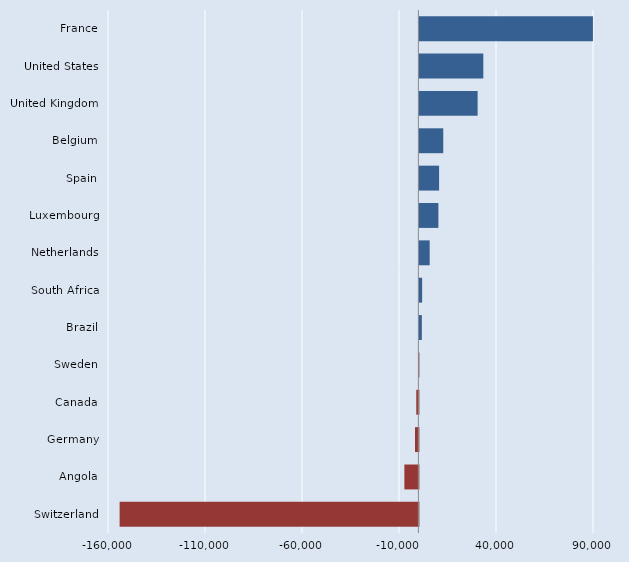
| Category | Series 0 |
|---|---|
| France | 89450 |
| United States | 32950 |
| United Kingdom | 30010 |
| Belgium | 12300 |
| Spain | 10150 |
| Luxembourg | 9790 |
| Netherlands | 5300 |
| South Africa | 1410 |
| Brazil | 1250 |
| Sweden | -110 |
| Canada | -1090 |
| Germany | -1760 |
| Angola | -7230 |
| Switzerland | -154010 |